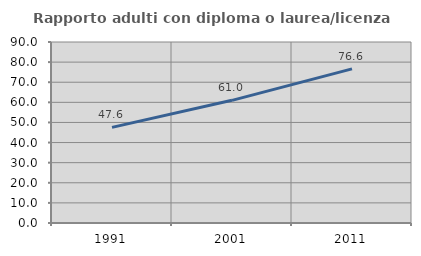
| Category | Rapporto adulti con diploma o laurea/licenza media  |
|---|---|
| 1991.0 | 47.564 |
| 2001.0 | 60.993 |
| 2011.0 | 76.641 |